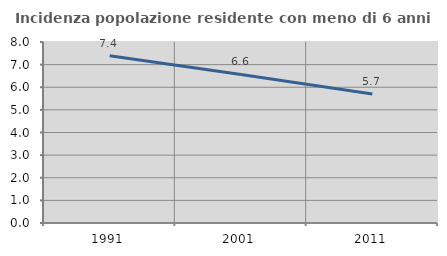
| Category | Incidenza popolazione residente con meno di 6 anni |
|---|---|
| 1991.0 | 7.395 |
| 2001.0 | 6.566 |
| 2011.0 | 5.705 |